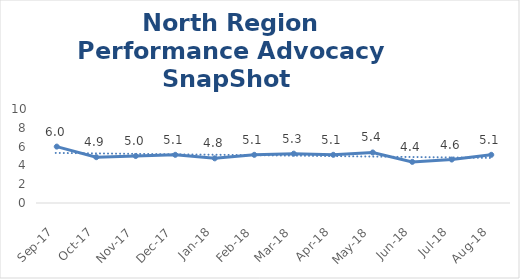
| Category | North Region |
|---|---|
| Sep-17 | 6 |
| Oct-17 | 4.875 |
| Nov-17 | 5 |
| Dec-17 | 5.125 |
| Jan-18 | 4.75 |
| Feb-18 | 5.125 |
| Mar-18 | 5.25 |
| Apr-18 | 5.125 |
| May-18 | 5.375 |
| Jun-18 | 4.375 |
| Jul-18 | 4.625 |
| Aug-18 | 5.125 |